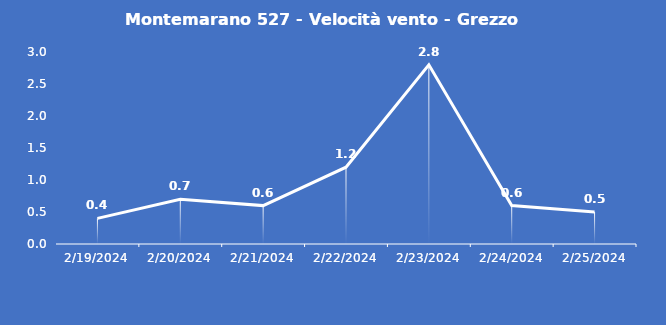
| Category | Montemarano 527 - Velocità vento - Grezzo (m/s) |
|---|---|
| 2/19/24 | 0.4 |
| 2/20/24 | 0.7 |
| 2/21/24 | 0.6 |
| 2/22/24 | 1.2 |
| 2/23/24 | 2.8 |
| 2/24/24 | 0.6 |
| 2/25/24 | 0.5 |